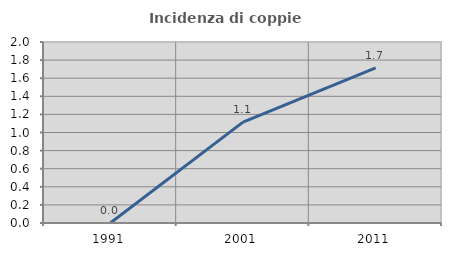
| Category | Incidenza di coppie miste |
|---|---|
| 1991.0 | 0 |
| 2001.0 | 1.114 |
| 2011.0 | 1.714 |